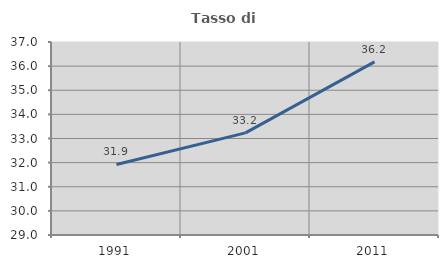
| Category | Tasso di occupazione   |
|---|---|
| 1991.0 | 31.923 |
| 2001.0 | 33.233 |
| 2011.0 | 36.175 |